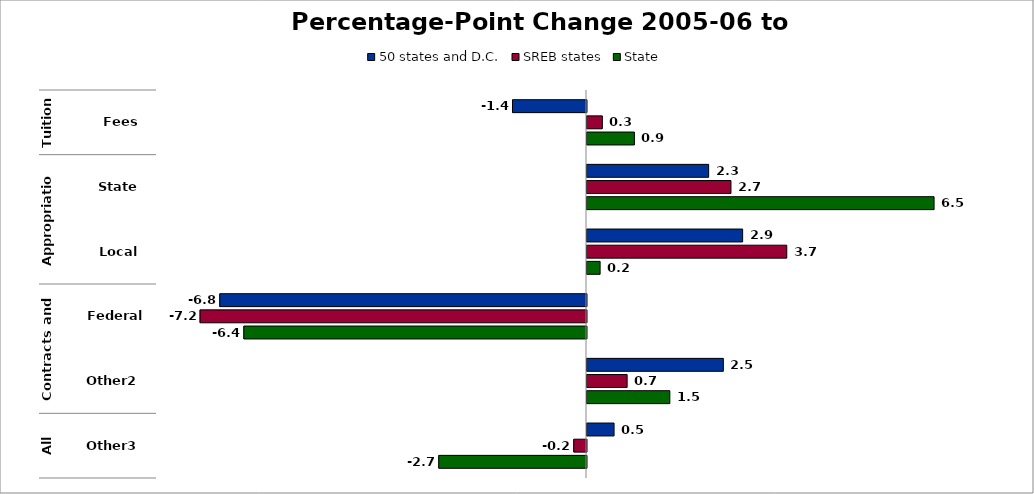
| Category | 50 states and D.C. | SREB states | State |
|---|---|---|---|
| 0 | -1.376 | 0.286 | 0.882 |
| 1 | 2.263 | 2.678 | 6.457 |
| 2 | 2.896 | 3.717 | 0.244 |
| 3 | -6.823 | -7.19 | -6.376 |
| 4 | 2.537 | 0.747 | 1.541 |
| 5 | 0.504 | -0.237 | -2.749 |